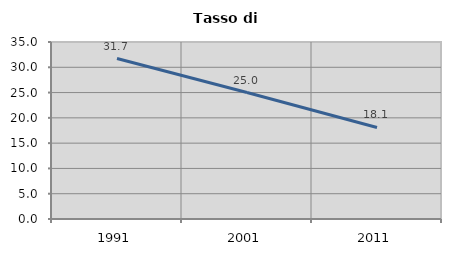
| Category | Tasso di disoccupazione   |
|---|---|
| 1991.0 | 31.723 |
| 2001.0 | 25 |
| 2011.0 | 18.095 |